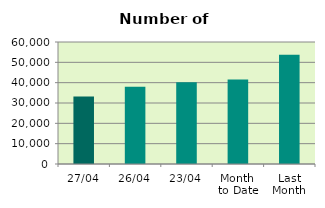
| Category | Series 0 |
|---|---|
| 27/04 | 33196 |
| 26/04 | 37984 |
| 23/04 | 40192 |
| Month 
to Date | 41586.824 |
| Last
Month | 53669.217 |